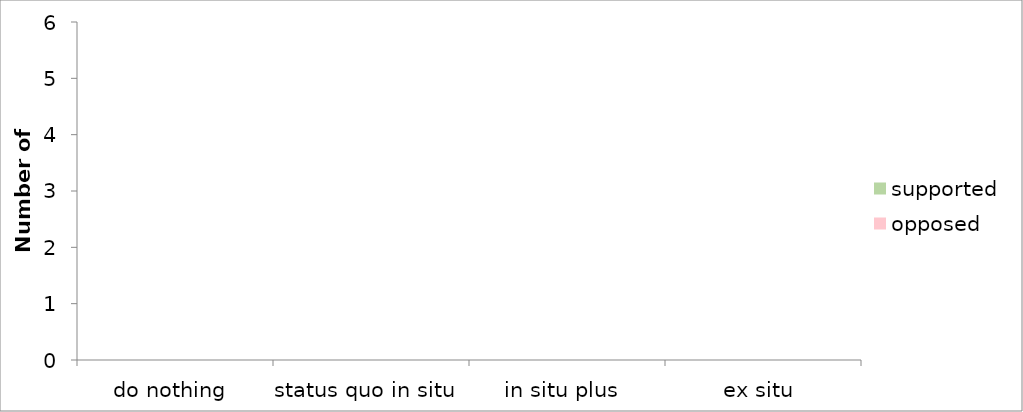
| Category | supported | opposed |
|---|---|---|
| do nothing | 0 | 0 |
| status quo in situ | 0 | 0 |
| in situ plus | 0 | 0 |
| ex situ | 0 | 0 |